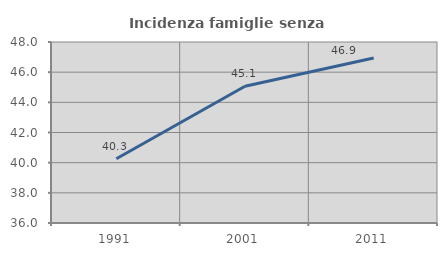
| Category | Incidenza famiglie senza nuclei |
|---|---|
| 1991.0 | 40.26 |
| 2001.0 | 45.064 |
| 2011.0 | 46.943 |